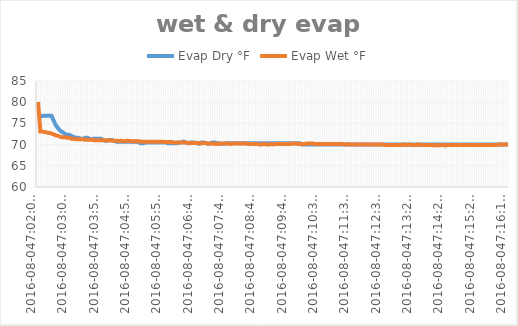
| Category | Evap Dry °F | Evap Wet °F |
|---|---|---|
| 2016-08-047:02:03 PM | 76.6 | 80.038 |
| 2016-08-047:02:07 PM | 76.6 | 73.062 |
| 2016-08-047:02:11 PM | 76.8 | 73.062 |
| 2016-08-047:02:15 PM | 76.8 | 72.95 |
| 2016-08-047:02:20 PM | 76.8 | 72.838 |
| 2016-08-047:02:24 PM | 76.8 | 72.725 |
| 2016-08-047:02:28 PM | 76.8 | 72.612 |
| 2016-08-047:02:32 PM | 75.6 | 72.388 |
| 2016-08-047:02:36 PM | 74.5 | 72.162 |
| 2016-08-047:02:40 PM | 73.8 | 72.05 |
| 2016-08-047:02:44 PM | 73.2 | 71.825 |
| 2016-08-047:02:49 PM | 72.9 | 71.712 |
| 2016-08-047:02:53 PM | 72.5 | 71.712 |
| 2016-08-047:02:57 PM | 72.3 | 71.6 |
| 2016-08-047:03:01 PM | 72.3 | 71.6 |
| 2016-08-047:03:05 PM | 72 | 71.375 |
| 2016-08-047:03:09 PM | 71.8 | 71.375 |
| 2016-08-047:03:13 PM | 71.6 | 71.262 |
| 2016-08-047:03:18 PM | 71.6 | 71.262 |
| 2016-08-047:03:22 PM | 71.4 | 71.262 |
| 2016-08-047:03:26 PM | 71.4 | 71.262 |
| 2016-08-047:03:30 PM | 71.6 | 71.15 |
| 2016-08-047:03:34 PM | 71.6 | 71.15 |
| 2016-08-047:03:38 PM | 71.4 | 71.15 |
| 2016-08-047:03:42 PM | 71.2 | 71.15 |
| 2016-08-047:03:46 PM | 71.4 | 71.038 |
| 2016-08-047:03:50 PM | 71.4 | 71.038 |
| 2016-08-047:03:54 PM | 71.4 | 71.038 |
| 2016-08-047:03:58 PM | 71.4 | 71.038 |
| 2016-08-047:04:02 PM | 71.1 | 71.038 |
| 2016-08-047:04:07 PM | 70.9 | 71.038 |
| 2016-08-047:04:11 PM | 70.9 | 71.038 |
| 2016-08-047:04:15 PM | 71.1 | 71.038 |
| 2016-08-047:04:19 PM | 71.1 | 70.925 |
| 2016-08-047:04:23 PM | 70.9 | 70.925 |
| 2016-08-047:04:27 PM | 70.7 | 70.925 |
| 2016-08-047:04:31 PM | 70.7 | 70.812 |
| 2016-08-047:04:35 PM | 70.7 | 70.925 |
| 2016-08-047:04:39 PM | 70.7 | 70.812 |
| 2016-08-047:04:43 PM | 70.7 | 70.812 |
| 2016-08-047:04:47 PM | 70.7 | 70.925 |
| 2016-08-047:04:51 PM | 70.7 | 70.812 |
| 2016-08-047:04:55 PM | 70.7 | 70.812 |
| 2016-08-047:04:59 PM | 70.7 | 70.812 |
| 2016-08-047:05:03 PM | 70.7 | 70.812 |
| 2016-08-047:05:07 PM | 70.5 | 70.812 |
| 2016-08-047:05:11 PM | 70.3 | 70.7 |
| 2016-08-047:05:15 PM | 70.3 | 70.7 |
| 2016-08-047:05:19 PM | 70.5 | 70.7 |
| 2016-08-047:05:24 PM | 70.5 | 70.7 |
| 2016-08-047:05:28 PM | 70.5 | 70.7 |
| 2016-08-047:05:32 PM | 70.5 | 70.7 |
| 2016-08-047:05:36 PM | 70.5 | 70.7 |
| 2016-08-047:05:40 PM | 70.5 | 70.7 |
| 2016-08-047:05:44 PM | 70.5 | 70.7 |
| 2016-08-047:05:48 PM | 70.5 | 70.7 |
| 2016-08-047:05:52 PM | 70.5 | 70.588 |
| 2016-08-047:05:56 PM | 70.5 | 70.588 |
| 2016-08-047:06:00 PM | 70.3 | 70.588 |
| 2016-08-047:06:04 PM | 70.3 | 70.588 |
| 2016-08-047:06:08 PM | 70.3 | 70.588 |
| 2016-08-047:06:12 PM | 70.3 | 70.475 |
| 2016-08-047:06:16 PM | 70.3 | 70.475 |
| 2016-08-047:06:20 PM | 70.5 | 70.475 |
| 2016-08-047:06:24 PM | 70.5 | 70.475 |
| 2016-08-047:06:29 PM | 70.7 | 70.475 |
| 2016-08-047:06:33 PM | 70.5 | 70.475 |
| 2016-08-047:06:37 PM | 70.3 | 70.362 |
| 2016-08-047:06:41 PM | 70.5 | 70.362 |
| 2016-08-047:06:45 PM | 70.5 | 70.362 |
| 2016-08-047:06:49 PM | 70.5 | 70.362 |
| 2016-08-047:06:53 PM | 70.3 | 70.362 |
| 2016-08-047:06:57 PM | 70.2 | 70.362 |
| 2016-08-047:07:01 PM | 70.5 | 70.25 |
| 2016-08-047:07:05 PM | 70.5 | 70.362 |
| 2016-08-047:07:09 PM | 70.3 | 70.362 |
| 2016-08-047:07:13 PM | 70.2 | 70.25 |
| 2016-08-047:07:17 PM | 70.3 | 70.25 |
| 2016-08-047:07:21 PM | 70.5 | 70.25 |
| 2016-08-047:07:25 PM | 70.5 | 70.138 |
| 2016-08-047:07:30 PM | 70.3 | 70.25 |
| 2016-08-047:07:34 PM | 70.3 | 70.138 |
| 2016-08-047:07:38 PM | 70.2 | 70.25 |
| 2016-08-047:07:42 PM | 70.2 | 70.25 |
| 2016-08-047:07:46 PM | 70.3 | 70.25 |
| 2016-08-047:07:50 PM | 70.3 | 70.25 |
| 2016-08-047:07:54 PM | 70.3 | 70.138 |
| 2016-08-047:07:58 PM | 70.3 | 70.25 |
| 2016-08-047:08:02 PM | 70.3 | 70.25 |
| 2016-08-047:08:06 PM | 70.3 | 70.25 |
| 2016-08-047:08:10 PM | 70.3 | 70.25 |
| 2016-08-047:08:14 PM | 70.3 | 70.25 |
| 2016-08-047:08:18 PM | 70.3 | 70.25 |
| 2016-08-047:08:23 PM | 70.3 | 70.25 |
| 2016-08-047:08:27 PM | 70.3 | 70.138 |
| 2016-08-047:08:31 PM | 70.3 | 70.138 |
| 2016-08-047:08:35 PM | 70.3 | 70.138 |
| 2016-08-047:08:39 PM | 70.3 | 70.138 |
| 2016-08-047:08:43 PM | 70.3 | 70.138 |
| 2016-08-047:08:47 PM | 70.3 | 70.025 |
| 2016-08-047:08:51 PM | 70.3 | 70.025 |
| 2016-08-047:08:55 PM | 70.3 | 70.138 |
| 2016-08-047:09:00 PM | 70.3 | 70.025 |
| 2016-08-047:09:04 PM | 70.3 | 70.025 |
| 2016-08-047:09:08 PM | 70.3 | 70.138 |
| 2016-08-047:09:12 PM | 70.3 | 70.025 |
| 2016-08-047:09:16 PM | 70.3 | 70.138 |
| 2016-08-047:09:20 PM | 70.3 | 70.138 |
| 2016-08-047:09:24 PM | 70.3 | 70.138 |
| 2016-08-047:09:28 PM | 70.3 | 70.138 |
| 2016-08-047:09:32 PM | 70.3 | 70.138 |
| 2016-08-047:09:36 PM | 70.3 | 70.138 |
| 2016-08-047:09:40 PM | 70.3 | 70.138 |
| 2016-08-047:09:44 PM | 70.3 | 70.138 |
| 2016-08-047:09:48 PM | 70.3 | 70.25 |
| 2016-08-047:09:53 PM | 70.3 | 70.25 |
| 2016-08-047:09:57 PM | 70.3 | 70.138 |
| 2016-08-047:10:01 PM | 70.3 | 70.138 |
| 2016-08-047:10:05 PM | 70 | 70.138 |
| 2016-08-047:10:09 PM | 70 | 70.138 |
| 2016-08-047:10:13 PM | 70 | 70.25 |
| 2016-08-047:10:17 PM | 70 | 70.25 |
| 2016-08-047:10:21 PM | 70 | 70.25 |
| 2016-08-047:10:25 PM | 70 | 70.25 |
| 2016-08-047:10:29 PM | 70 | 70.138 |
| 2016-08-047:10:33 PM | 70 | 70.138 |
| 2016-08-047:10:37 PM | 70 | 70.138 |
| 2016-08-047:10:41 PM | 70 | 70.138 |
| 2016-08-047:10:45 PM | 70 | 70.138 |
| 2016-08-047:10:49 PM | 70 | 70.138 |
| 2016-08-047:10:53 PM | 70 | 70.138 |
| 2016-08-047:10:57 PM | 70 | 70.138 |
| 2016-08-047:11:01 PM | 70 | 70.138 |
| 2016-08-047:11:05 PM | 70 | 70.138 |
| 2016-08-047:11:09 PM | 70 | 70.138 |
| 2016-08-047:11:13 PM | 70 | 70.138 |
| 2016-08-047:11:18 PM | 70 | 70.138 |
| 2016-08-047:11:22 PM | 70 | 70.025 |
| 2016-08-047:11:26 PM | 70 | 70.138 |
| 2016-08-047:11:30 PM | 70 | 70.025 |
| 2016-08-047:11:34 PM | 70 | 70.025 |
| 2016-08-047:11:38 PM | 70 | 70.025 |
| 2016-08-047:11:42 PM | 70 | 70.025 |
| 2016-08-047:11:46 PM | 70 | 70.025 |
| 2016-08-047:11:50 PM | 70 | 70.025 |
| 2016-08-047:11:54 PM | 70 | 70.025 |
| 2016-08-047:11:58 PM | 70 | 70.025 |
| 2016-08-047:12:03 PM | 70 | 70.025 |
| 2016-08-047:12:07 PM | 70 | 70.025 |
| 2016-08-047:12:11 PM | 70 | 70.025 |
| 2016-08-047:12:15 PM | 70 | 70.025 |
| 2016-08-047:12:19 PM | 70 | 70.025 |
| 2016-08-047:12:23 PM | 70 | 70.025 |
| 2016-08-047:12:27 PM | 70 | 70.025 |
| 2016-08-047:12:31 PM | 70 | 70.025 |
| 2016-08-047:12:35 PM | 70 | 69.912 |
| 2016-08-047:12:39 PM | 70 | 69.912 |
| 2016-08-047:12:43 PM | 70 | 69.912 |
| 2016-08-047:12:47 PM | 70 | 69.912 |
| 2016-08-047:12:51 PM | 70 | 69.912 |
| 2016-08-047:12:55 PM | 70 | 69.912 |
| 2016-08-047:13:00 PM | 70 | 69.912 |
| 2016-08-047:13:04 PM | 70 | 69.912 |
| 2016-08-047:13:08 PM | 70 | 69.912 |
| 2016-08-047:13:12 PM | 70 | 70.025 |
| 2016-08-047:13:16 PM | 70 | 69.912 |
| 2016-08-047:13:20 PM | 70 | 70.025 |
| 2016-08-047:13:24 PM | 70 | 69.912 |
| 2016-08-047:13:28 PM | 70 | 69.912 |
| 2016-08-047:13:32 PM | 70 | 69.912 |
| 2016-08-047:13:36 PM | 70 | 70.025 |
| 2016-08-047:13:40 PM | 70 | 69.912 |
| 2016-08-047:13:44 PM | 70 | 69.912 |
| 2016-08-047:13:48 PM | 70 | 69.912 |
| 2016-08-047:13:52 PM | 70 | 69.912 |
| 2016-08-047:13:56 PM | 70 | 69.912 |
| 2016-08-047:14:00 PM | 70 | 69.912 |
| 2016-08-047:14:05 PM | 70 | 69.8 |
| 2016-08-047:14:09 PM | 70 | 69.912 |
| 2016-08-047:14:13 PM | 70 | 69.8 |
| 2016-08-047:14:17 PM | 70 | 69.912 |
| 2016-08-047:14:21 PM | 70 | 69.912 |
| 2016-08-047:14:25 PM | 70 | 69.8 |
| 2016-08-047:14:29 PM | 70 | 69.912 |
| 2016-08-047:14:33 PM | 70 | 69.912 |
| 2016-08-047:14:37 PM | 70 | 69.912 |
| 2016-08-047:14:41 PM | 70 | 69.912 |
| 2016-08-047:14:45 PM | 70 | 69.912 |
| 2016-08-047:14:49 PM | 70 | 69.912 |
| 2016-08-047:14:53 PM | 70 | 69.912 |
| 2016-08-047:14:58 PM | 70 | 69.912 |
| 2016-08-047:15:02 PM | 70 | 69.912 |
| 2016-08-047:15:06 PM | 70 | 69.912 |
| 2016-08-047:15:10 PM | 70 | 69.912 |
| 2016-08-047:15:14 PM | 70 | 69.912 |
| 2016-08-047:15:18 PM | 70 | 69.912 |
| 2016-08-047:15:22 PM | 70 | 69.912 |
| 2016-08-047:15:26 PM | 70 | 69.912 |
| 2016-08-047:15:30 PM | 70 | 69.912 |
| 2016-08-047:15:34 PM | 70 | 69.912 |
| 2016-08-047:15:38 PM | 70 | 69.912 |
| 2016-08-047:15:42 PM | 70 | 69.912 |
| 2016-08-047:15:46 PM | 70 | 69.912 |
| 2016-08-047:15:50 PM | 70 | 69.912 |
| 2016-08-047:15:54 PM | 70 | 69.912 |
| 2016-08-047:15:58 PM | 70 | 69.912 |
| 2016-08-047:16:03 PM | 70 | 70.025 |
| 2016-08-047:16:07 PM | 70 | 70.025 |
| 2016-08-047:16:11 PM | 70 | 70.025 |
| 2016-08-047:16:15 PM | 70 | 70.025 |
| 2016-08-047:16:19 PM | 70 | 70.025 |